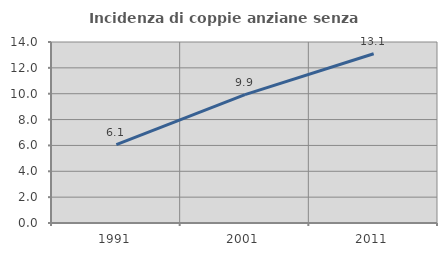
| Category | Incidenza di coppie anziane senza figli  |
|---|---|
| 1991.0 | 6.065 |
| 2001.0 | 9.929 |
| 2011.0 | 13.094 |